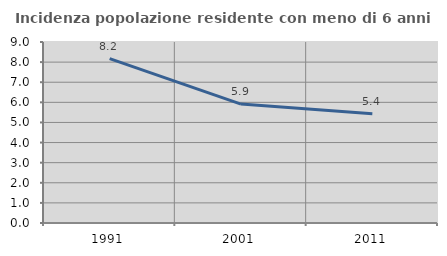
| Category | Incidenza popolazione residente con meno di 6 anni |
|---|---|
| 1991.0 | 8.175 |
| 2001.0 | 5.913 |
| 2011.0 | 5.437 |